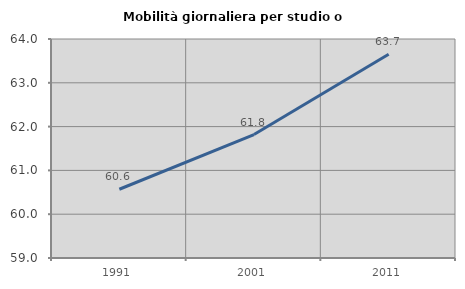
| Category | Mobilità giornaliera per studio o lavoro |
|---|---|
| 1991.0 | 60.57 |
| 2001.0 | 61.819 |
| 2011.0 | 63.65 |